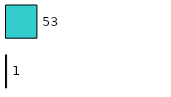
| Category | Series 0 | Series 1 |
|---|---|---|
| 0 | 1 | 53 |